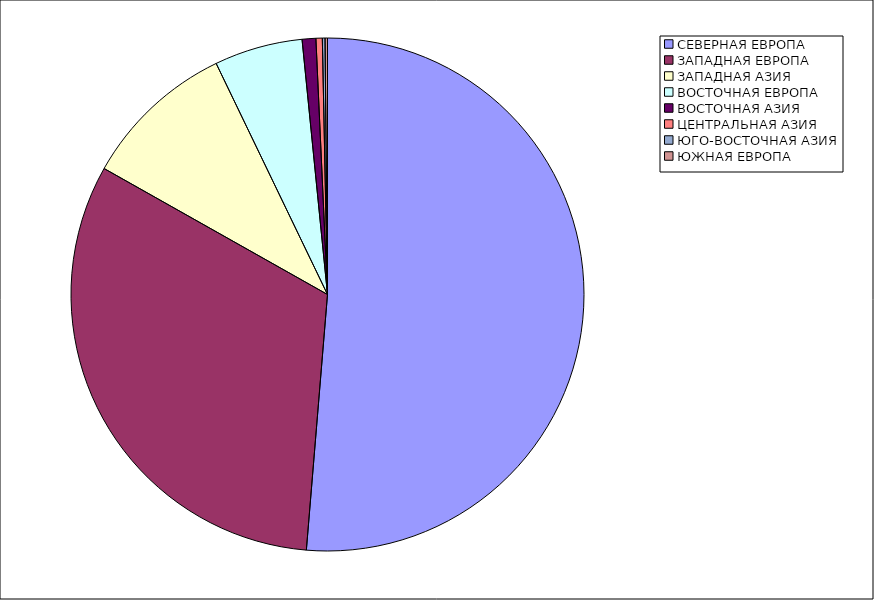
| Category | Оборот |
|---|---|
| СЕВЕРНАЯ ЕВРОПА | 51.314 |
| ЗАПАДНАЯ ЕВРОПА | 31.859 |
| ЗАПАДНАЯ АЗИЯ | 9.68 |
| ВОСТОЧНАЯ ЕВРОПА | 5.564 |
| ВОСТОЧНАЯ АЗИЯ | 0.862 |
| ЦЕНТРАЛЬНАЯ АЗИЯ | 0.4 |
| ЮГО-ВОСТОЧНАЯ АЗИЯ | 0.17 |
| ЮЖНАЯ ЕВРОПА | 0.152 |